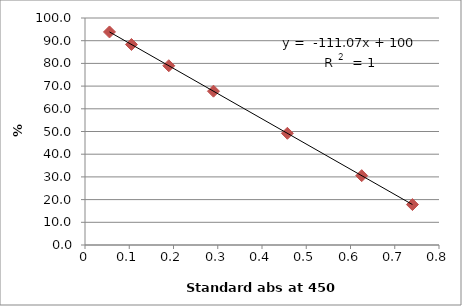
| Category | Series 0 |
|---|---|
| 0.0553333333333333 | 93.854 |
| 0.105 | 88.338 |
| 0.189333333333333 | 78.971 |
| 0.290333333333333 | 67.753 |
| 0.457333333333333 | 49.204 |
| 0.625333333333333 | 30.544 |
| 0.74 | 17.808 |